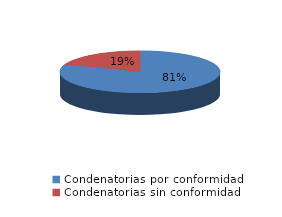
| Category | Series 0 |
|---|---|
| 0 | 25 |
| 1 | 6 |